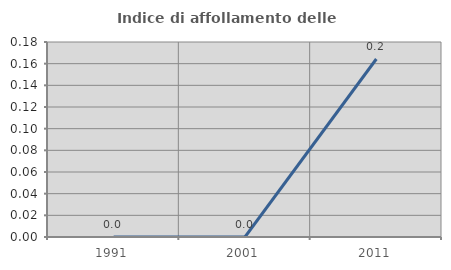
| Category | Indice di affollamento delle abitazioni  |
|---|---|
| 1991.0 | 0 |
| 2001.0 | 0 |
| 2011.0 | 0.164 |